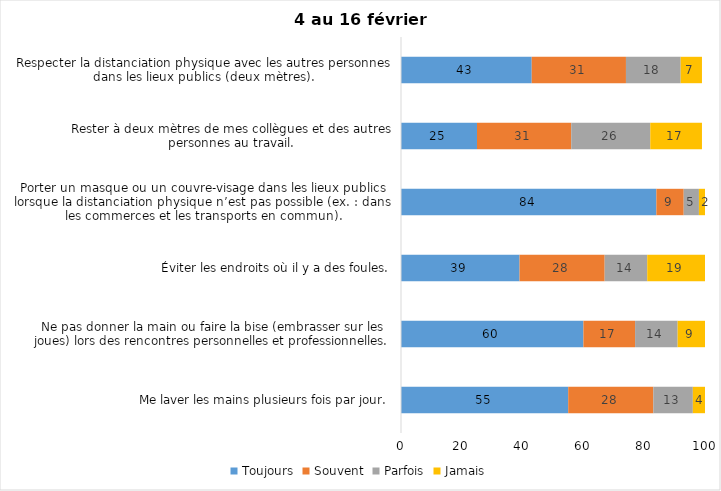
| Category | Toujours | Souvent | Parfois | Jamais |
|---|---|---|---|---|
| Me laver les mains plusieurs fois par jour. | 55 | 28 | 13 | 4 |
| Ne pas donner la main ou faire la bise (embrasser sur les joues) lors des rencontres personnelles et professionnelles. | 60 | 17 | 14 | 9 |
| Éviter les endroits où il y a des foules. | 39 | 28 | 14 | 19 |
| Porter un masque ou un couvre-visage dans les lieux publics lorsque la distanciation physique n’est pas possible (ex. : dans les commerces et les transports en commun). | 84 | 9 | 5 | 2 |
| Rester à deux mètres de mes collègues et des autres personnes au travail. | 25 | 31 | 26 | 17 |
| Respecter la distanciation physique avec les autres personnes dans les lieux publics (deux mètres). | 43 | 31 | 18 | 7 |